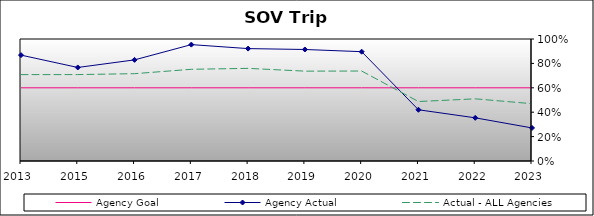
| Category | Agency Goal | Agency Actual | Actual - ALL Agencies |
|---|---|---|---|
| 2013.0 | 0.6 | 0.868 | 0.708 |
| 2015.0 | 0.6 | 0.767 | 0.708 |
| 2016.0 | 0.6 | 0.829 | 0.716 |
| 2017.0 | 0.6 | 0.954 | 0.752 |
| 2018.0 | 0.6 | 0.921 | 0.759 |
| 2019.0 | 0.6 | 0.914 | 0.736 |
| 2020.0 | 0.6 | 0.896 | 0.737 |
| 2021.0 | 0.6 | 0.42 | 0.487 |
| 2022.0 | 0.6 | 0.354 | 0.509 |
| 2023.0 | 0.6 | 0.271 | 0.47 |